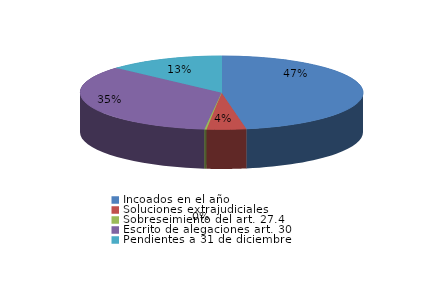
| Category | Series 0 |
|---|---|
| Incoados en el año | 2311 |
| Soluciones extrajudiciales | 219 |
| Sobreseimiento del art. 27.4 | 12 |
| Escrito de alegaciones art. 30 | 1702 |
| Pendientes a 31 de diciembre | 652 |